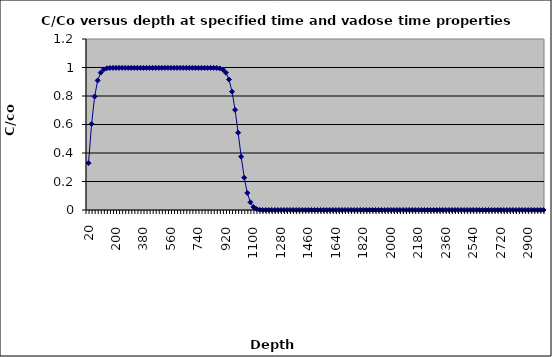
| Category | Series 0 |
|---|---|
| 20.0 | 0.329 |
| 40.0 | 0.604 |
| 60.0 | 0.796 |
| 80.0 | 0.909 |
| 100.0 | 0.964 |
| 120.0 | 0.987 |
| 140.0 | 0.995 |
| 160.0 | 0.997 |
| 180.0 | 0.997 |
| 200.0 | 0.997 |
| 220.0 | 0.997 |
| 240.0 | 0.997 |
| 260.0 | 0.997 |
| 280.0 | 0.997 |
| 300.0 | 0.997 |
| 320.0 | 0.997 |
| 340.0 | 0.997 |
| 360.0 | 0.997 |
| 380.0 | 0.997 |
| 400.0 | 0.997 |
| 420.0 | 0.997 |
| 440.0 | 0.997 |
| 460.0 | 0.997 |
| 480.0 | 0.997 |
| 500.0 | 0.997 |
| 520.0 | 0.997 |
| 540.0 | 0.997 |
| 560.0 | 0.997 |
| 580.0 | 0.997 |
| 600.0 | 0.997 |
| 620.0 | 0.997 |
| 640.0 | 0.997 |
| 660.0 | 0.997 |
| 680.0 | 0.997 |
| 700.0 | 0.997 |
| 720.0 | 0.997 |
| 740.0 | 0.997 |
| 760.0 | 0.997 |
| 780.0 | 0.997 |
| 800.0 | 0.997 |
| 820.0 | 0.997 |
| 840.0 | 0.997 |
| 860.0 | 0.997 |
| 880.0 | 0.994 |
| 900.0 | 0.985 |
| 920.0 | 0.963 |
| 940.0 | 0.916 |
| 960.0 | 0.831 |
| 980.0 | 0.703 |
| 1000.0 | 0.542 |
| 1020.0 | 0.374 |
| 1040.0 | 0.227 |
| 1060.0 | 0.12 |
| 1080.0 | 0.054 |
| 1100.0 | 0.021 |
| 1120.0 | 0.007 |
| 1140.0 | 0.002 |
| 1160.0 | 0 |
| 1180.0 | 0 |
| 1200.0 | 0 |
| 1220.0 | 0 |
| 1240.0 | 0 |
| 1260.0 | 0 |
| 1280.0 | 0 |
| 1300.0 | 0 |
| 1320.0 | 0 |
| 1340.0 | 0 |
| 1360.0 | 0 |
| 1380.0 | 0 |
| 1400.0 | 0 |
| 1420.0 | 0 |
| 1440.0 | 0 |
| 1460.0 | 0 |
| 1480.0 | 0 |
| 1500.0 | 0 |
| 1520.0 | 0 |
| 1540.0 | 0 |
| 1560.0 | 0 |
| 1580.0 | 0 |
| 1600.0 | 0 |
| 1620.0 | 0 |
| 1640.0 | 0 |
| 1660.0 | 0 |
| 1680.0 | 0 |
| 1700.0 | 0 |
| 1720.0 | 0 |
| 1740.0 | 0 |
| 1760.0 | 0 |
| 1780.0 | 0 |
| 1800.0 | 0 |
| 1820.0 | 0 |
| 1840.0 | 0 |
| 1860.0 | 0 |
| 1880.0 | 0 |
| 1900.0 | 0 |
| 1920.0 | 0 |
| 1940.0 | 0 |
| 1960.0 | 0 |
| 1980.0 | 0 |
| 2000.0 | 0 |
| 2020.0 | 0 |
| 2040.0 | 0 |
| 2060.0 | 0 |
| 2080.0 | 0 |
| 2100.0 | 0 |
| 2120.0 | 0 |
| 2140.0 | 0 |
| 2160.0 | 0 |
| 2180.0 | 0 |
| 2200.0 | 0 |
| 2220.0 | 0 |
| 2240.0 | 0 |
| 2260.0 | 0 |
| 2280.0 | 0 |
| 2300.0 | 0 |
| 2320.0 | 0 |
| 2340.0 | 0 |
| 2360.0 | 0 |
| 2380.0 | 0 |
| 2400.0 | 0 |
| 2420.0 | 0 |
| 2440.0 | 0 |
| 2460.0 | 0 |
| 2480.0 | 0 |
| 2500.0 | 0 |
| 2520.0 | 0 |
| 2540.0 | 0 |
| 2560.0 | 0 |
| 2580.0 | 0 |
| 2600.0 | 0 |
| 2620.0 | 0 |
| 2640.0 | 0 |
| 2660.0 | 0 |
| 2680.0 | 0 |
| 2700.0 | 0 |
| 2720.0 | 0 |
| 2740.0 | 0 |
| 2760.0 | 0 |
| 2780.0 | 0 |
| 2800.0 | 0 |
| 2820.0 | 0 |
| 2840.0 | 0 |
| 2860.0 | 0 |
| 2880.0 | 0 |
| 2900.0 | 0 |
| 2920.0 | 0 |
| 2940.0 | 0 |
| 2960.0 | 0 |
| 2980.0 | 0 |
| 3000.0 | 0 |